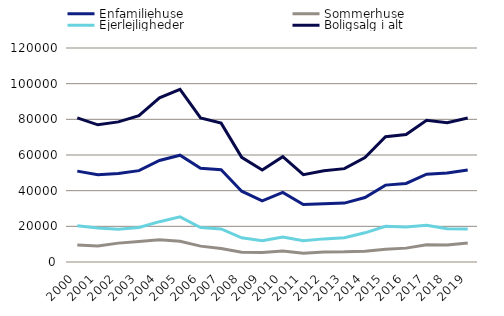
| Category | Enfamiliehuse | Sommerhuse | Ejerlejligheder | Boligsalg i alt |
|---|---|---|---|---|
| 2000 | 50965 | 9505 | 20325 | 80795 |
| 2001 | 48929 | 8975 | 19024 | 76928 |
| 2002 | 49618 | 10583 | 18364 | 78565 |
| 2003 | 51245 | 11482 | 19323 | 82050 |
| 2004 | 56951 | 12503 | 22615 | 92069 |
| 2005 | 59888 | 11610 | 25308 | 96806 |
| 2006 | 52564 | 8900 | 19341 | 80805 |
| 2007 | 51686 | 7624 | 18539 | 77849 |
| 2008 | 39702 | 5420 | 13546 | 58668 |
| 2009 | 34276 | 5354 | 11939 | 51569 |
| 2010 | 38987 | 6124 | 13968 | 59079 |
| 2011 | 32200 | 4892 | 11864 | 48956 |
| 2012 | 32631 | 5627 | 12964 | 51222 |
| 2013 | 33020 | 5704 | 13635 | 52359 |
| 2014 | 36135 | 6063 | 16355 | 58553 |
| 2015 | 43121 | 7087 | 20065 | 70273 |
| 2016 | 44074 | 7778 | 19605 | 71457 |
| 2017 | 49248 | 9682 | 20570 | 79500 |
| 2018 | 49935 | 9481 | 18667 | 78083 |
| 2019 | 51598 | 10618 | 18549 | 80765 |